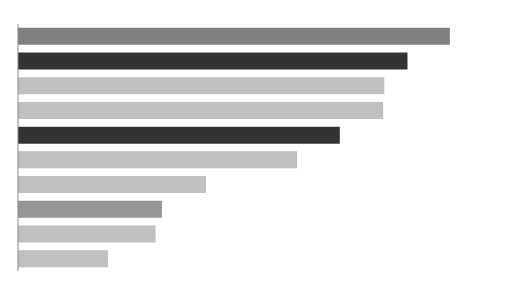
| Category | Balkengröße |
|---|---|
| Kategorie 2 | 280396 |
| Kategorie 3 | 252817 |
| Kategorie 8 | 237708 |
| Kategorie 1 | 237002 |
| Kategorie 5 | 208774 |
| Kategorie 10 | 180962 |
| Kategorie 9 | 121718 |
| Kategorie 4 | 93024 |
| Kategorie 7 | 88873 |
| Kategorie 6 | 57875 |